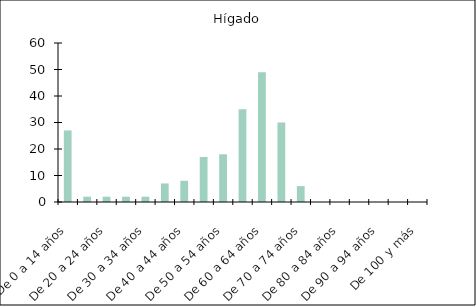
| Category | Hígado |
|---|---|
| De 0 a 14 años | 27 |
| De 15 a 19 años | 2 |
| De 20 a 24 años | 2 |
| De 25 a 29 años | 2 |
| De 30 a 34 años | 2 |
| De 35 a 39 años | 7 |
| De 40 a 44 años | 8 |
| De 45 a 49 años | 17 |
| De 50 a 54 años | 18 |
| De 55 a 59 años | 35 |
| De 60 a 64 años | 49 |
| De 65 a 69 años | 30 |
| De 70 a 74 años | 6 |
| De 75 a 79 años | 0 |
| De 80 a 84 años | 0 |
| De 85 a 89 años | 0 |
| De 90 a 94 años | 0 |
| De 95 a 99 años | 0 |
| De 100 y más | 0 |